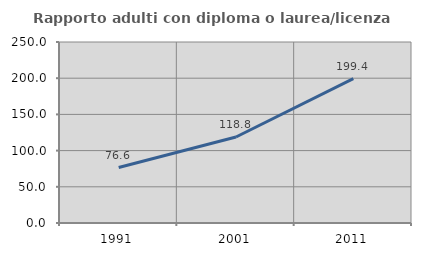
| Category | Rapporto adulti con diploma o laurea/licenza media  |
|---|---|
| 1991.0 | 76.634 |
| 2001.0 | 118.755 |
| 2011.0 | 199.423 |